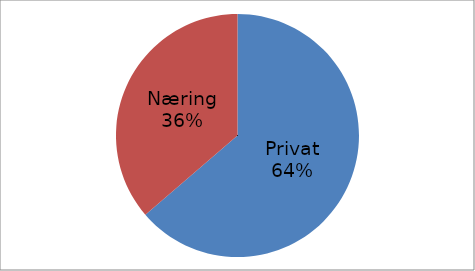
| Category | Series 0 |
|---|---|
| Privat | 42414822 |
| Næring | 24173834 |